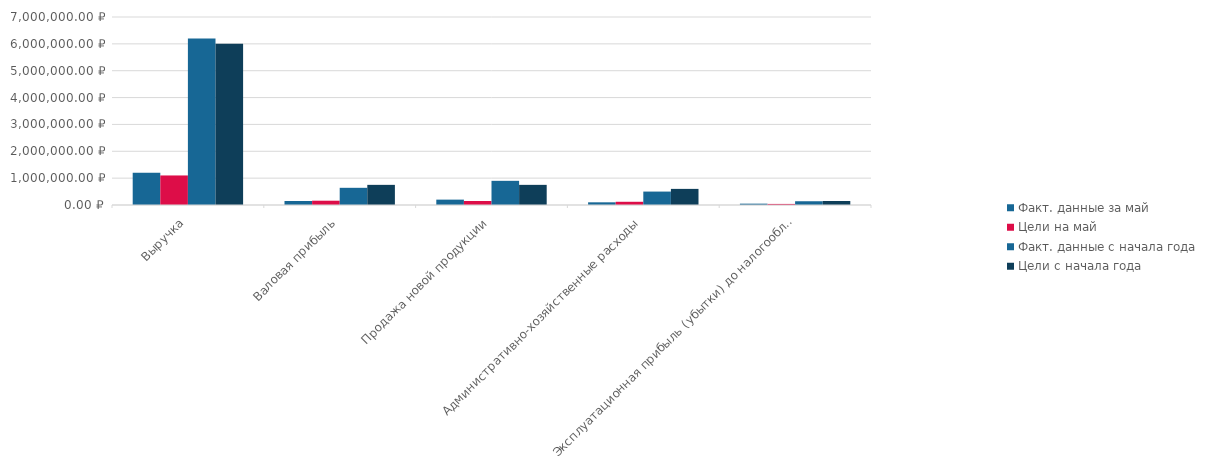
| Category | Факт. данные за май | Цели на май | Факт. данные с начала года | Цели с начала года |
|---|---|---|---|---|
| Выручка | 1200000 | 1100000 | 6200000 | 6000000 |
| Валовая прибыль | 150000 | 160000 | 640000 | 750000 |
| Продажа новой продукции | 200000 | 150000 | 900000 | 750000 |
| Административно-хозяйственные расходы | 100000 | 120000 | 500000 | 600000 |
| Эксплуатационная прибыль (убытки) до налогообложения | 50000 | 40000 | 140000 | 150000 |